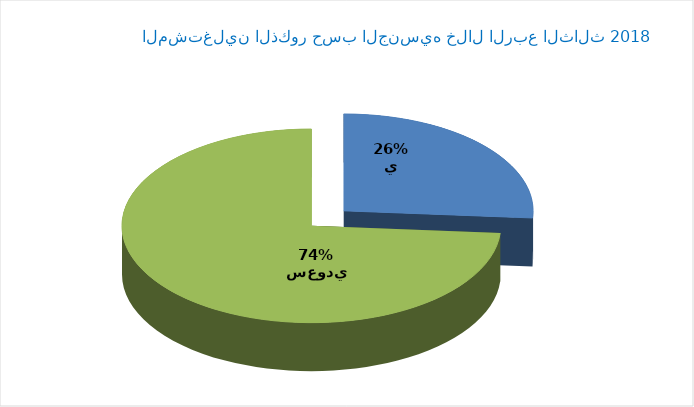
| Category | Series 0 |
|---|---|
| سعودي | 1640756 |
| غير سعودي | 4627812 |